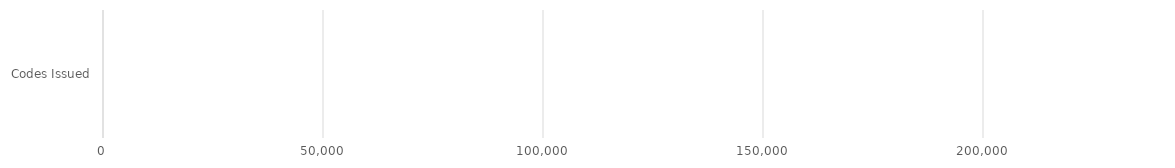
| Category | Series 0 |
|---|---|
| Codes Issued | 0 |